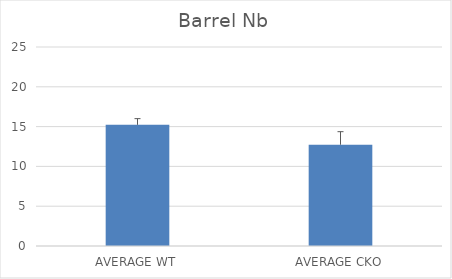
| Category | Series 0 |
|---|---|
| AVERAGE WT | 15.222 |
| AVERAGE CKO | 12.722 |